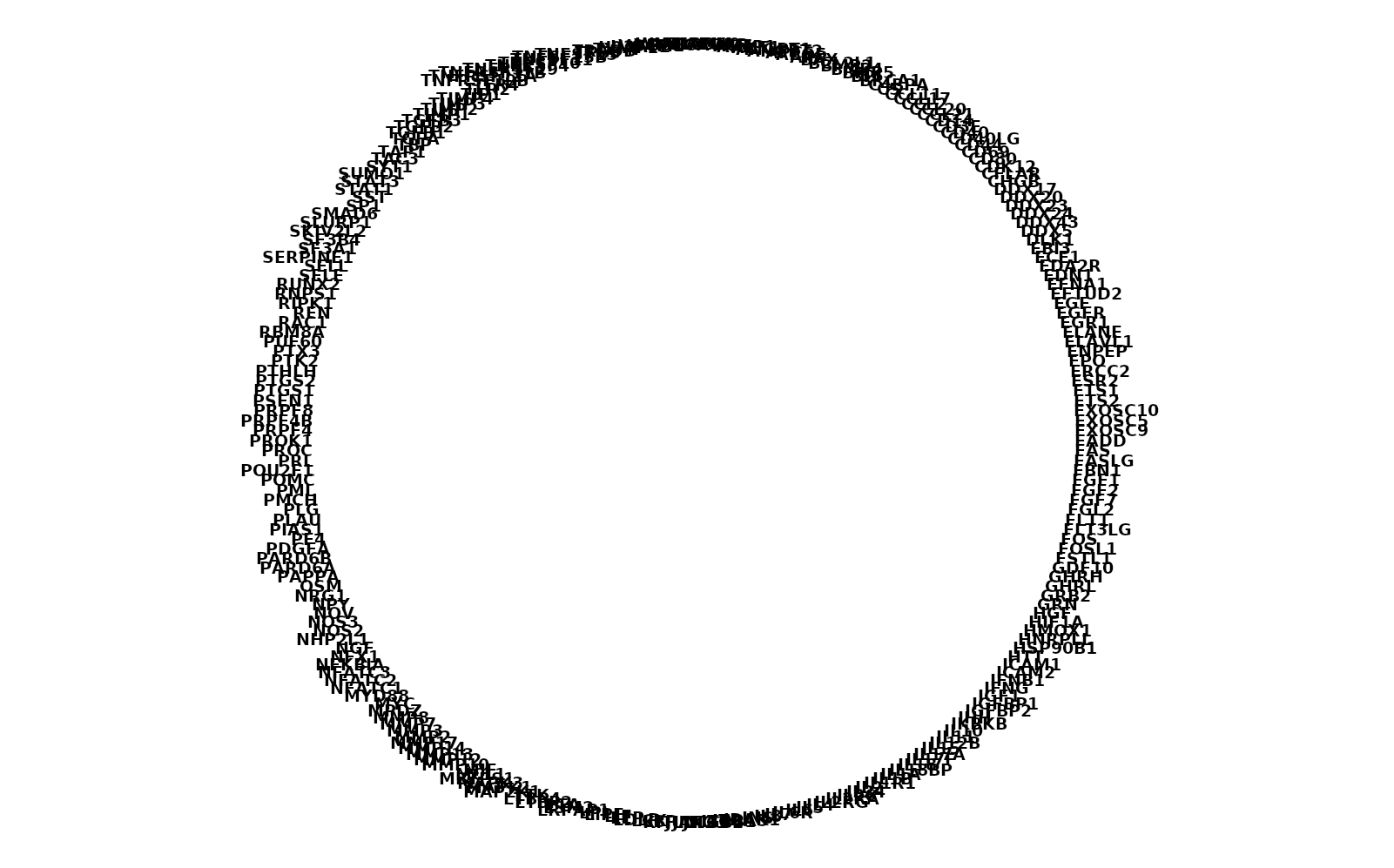
| Category | Series 0 |
|---|---|
| ADAM10 | 1 |
| ADM | 1 |
| AGRP | 1 |
| AGT | 1 |
| AIMP1 | 1 |
| AKT1 | 1 |
| ANGPT1 | 1 |
| ANGPT2 | 1 |
| APCS | 1 |
| APOE | 1 |
| APP | 1 |
| BAX | 1 |
| BCL2L1 | 1 |
| BMP2 | 1 |
| BMP4 | 1 |
| BMP5 | 1 |
| BPI | 1 |
| BRCA1 | 1 |
| C4BPA | 1 |
| C5 | 1 |
| CCL11 | 1 |
| CCL17 | 1 |
| CCL2 | 1 |
| CCL20 | 1 |
| CCL21 | 1 |
| CD14 | 1 |
| CD3E | 1 |
| CD40 | 1 |
| CD40LG | 1 |
| CD44 | 1 |
| CD69 | 1 |
| CD80 | 1 |
| CDK12 | 1 |
| CFLAR | 1 |
| CHGB | 1 |
| DDX17 | 1 |
| DDX20 | 1 |
| DDX23 | 1 |
| DDX24 | 1 |
| DDX43 | 1 |
| DDX5 | 1 |
| DLK1 | 1 |
| EBI3 | 1 |
| ECE1 | 1 |
| EDA2R | 1 |
| EDN1 | 1 |
| EFNA1 | 1 |
| EFTUD2 | 1 |
| EGF | 1 |
| EGFR | 1 |
| EGR1 | 1 |
| ELANE | 1 |
| ELAVL1 | 1 |
| ENPEP | 1 |
| EPO | 1 |
| ERCC2 | 1 |
| ESR2 | 1 |
| ETS1 | 1 |
| ETS2 | 1 |
| EXOSC10 | 1 |
| EXOSC5 | 1 |
| EXOSC9 | 1 |
| FADD | 1 |
| FAS | 1 |
| FASLG | 1 |
| FBN1 | 1 |
| FGF1 | 1 |
| FGF2 | 1 |
| FGF7 | 1 |
| FGL2 | 1 |
| FLT1 | 1 |
| FLT3LG | 1 |
| FOS | 1 |
| FOSL1 | 1 |
| FSTL1 | 1 |
| GDF10 | 1 |
| GHRH | 1 |
| GHRL | 1 |
| GRB2 | 1 |
| GRN | 1 |
| HGF | 1 |
| HIF1A | 1 |
| HMOX1 | 1 |
| HNRPLL | 1 |
| HSP90B1 | 1 |
| HTT | 1 |
| ICAM1 | 1 |
| ICAM2 | 1 |
| IFNB1 | 1 |
| IFNG | 1 |
| IGF1 | 1 |
| IGFBP1 | 1 |
| IGFBP2 | 1 |
| IHH | 1 |
| IKBKB | 1 |
| IL10 | 1 |
| IL11 | 1 |
| IL12B | 1 |
| IL15 | 1 |
| IL17A | 1 |
| IL17F | 1 |
| IL18 | 1 |
| IL18BP | 1 |
| IL1A | 1 |
| IL1B | 1 |
| IL1R1 | 1 |
| IL2 | 1 |
| IL24 | 1 |
| IL26 | 1 |
| IL2RA | 1 |
| IL2RG | 1 |
| IL4 | 1 |
| IL5 | 1 |
| IL6 | 1 |
| IL6R | 1 |
| IL7 | 1 |
| IL8 | 1 |
| INS | 1 |
| IRAK1 | 1 |
| ITGA5 | 1 |
| ITGB1 | 1 |
| ITGB2 | 1 |
| JAG1 | 1 |
| JAK2 | 1 |
| JUN | 1 |
| KITLG | 1 |
| LBP | 1 |
| LCK | 1 |
| LDLR | 1 |
| LEP | 1 |
| LIF | 1 |
| LIPE | 1 |
| LPL | 1 |
| LRPAP1 | 1 |
| LSM2 | 1 |
| LTA | 1 |
| LTBP2 | 1 |
| LTBP4 | 1 |
| LTK | 1 |
| MAP2K1 | 1 |
| MAPK1 | 1 |
| MAPK3 | 1 |
| MBTPS1 | 1 |
| MCL1 | 1 |
| MIF | 1 |
| MMP10 | 1 |
| MMP12 | 1 |
| MMP13 | 1 |
| MMP14 | 1 |
| MMP17 | 1 |
| MMP2 | 1 |
| MMP3 | 1 |
| MMP7 | 1 |
| MMP8 | 1 |
| MPDZ | 1 |
| MYC | 1 |
| MYD88 | 1 |
| NFATC1 | 1 |
| NFATC2 | 1 |
| NFATC3 | 1 |
| NFKBIA | 1 |
| NFX1 | 1 |
| NGF | 1 |
| NHP2L1 | 1 |
| NOS2 | 1 |
| NOS3 | 1 |
| NOV | 1 |
| NPY | 1 |
| NRG1 | 1 |
| OSM | 1 |
| PAPPA | 1 |
| PARD6A | 1 |
| PARD6B | 1 |
| PDGFA | 1 |
| PF4 | 1 |
| PIAS1 | 1 |
| PLAU | 1 |
| PLG | 1 |
| PMCH | 1 |
| PML | 1 |
| POMC | 1 |
| POU2F1 | 1 |
| PRL | 1 |
| PROC | 1 |
| PROK1 | 1 |
| PRPF4 | 1 |
| PRPF4B | 1 |
| PRPF8 | 1 |
| PSEN1 | 1 |
| PTGS1 | 1 |
| PTGS2 | 1 |
| PTHLH | 1 |
| PTK2 | 1 |
| PTX3 | 1 |
| PUF60 | 1 |
| RBM8A | 1 |
| RAC1 | 1 |
| REN | 1 |
| RIPK1 | 1 |
| RNPS1 | 1 |
| RUNX2 | 1 |
| SELE | 1 |
| SELL | 1 |
| SERPINE1 | 1 |
| SF3A1 | 1 |
| SF3B4 | 1 |
| SKIV2L2 | 1 |
| SLURP1 | 1 |
| SMAD6 | 1 |
| SP1 | 1 |
| SST | 1 |
| STAT1 | 1 |
| STAT3 | 1 |
| SUMO1 | 1 |
| SYT1 | 1 |
| TAC3 | 1 |
| TAP1 | 1 |
| TBP | 1 |
| TGFA | 1 |
| TGFB1 | 1 |
| TGFB2 | 1 |
| TGFB3 | 1 |
| TIMP1 | 1 |
| TIMP2 | 1 |
| TIMP3 | 1 |
| TIMP4 | 1 |
| TJP1 | 1 |
| TLR2 | 1 |
| TLR4 | 1 |
| TNFRSF10B | 1 |
| TNFRSF11A | 1 |
| TNFRSF11B | 1 |
| TNFRSF19 | 1 |
| TNFRSF4 | 1 |
| TNFSF10 | 1 |
| TNFSF11 | 1 |
| TNFSF13B | 1 |
| TNFSF15 | 1 |
| TP53 | 1 |
| TRADD | 1 |
| TYMP | 1 |
| U2AF1 | 1 |
| U2AF2 | 1 |
| VCAM1 | 1 |
| VEGFC | 1 |
| WNT10B | 1 |
| XIAP | 1 |